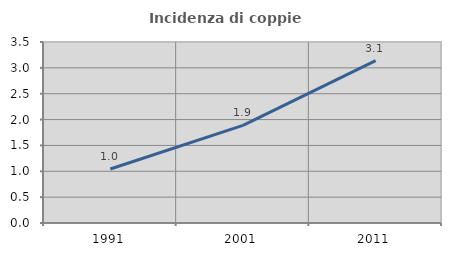
| Category | Incidenza di coppie miste |
|---|---|
| 1991.0 | 1.043 |
| 2001.0 | 1.888 |
| 2011.0 | 3.14 |